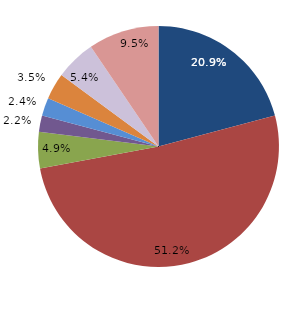
| Category | Series 0 |
|---|---|
| قبل الدخول | 20.867 |
| -1 | 51.22 |
| 1 | 4.878 |
| 2 | 2.168 |
| 3 | 2.439 |
| 4 | 3.523 |
|  5 - 9 | 5.42 |
| 10 - 14 | 9.485 |